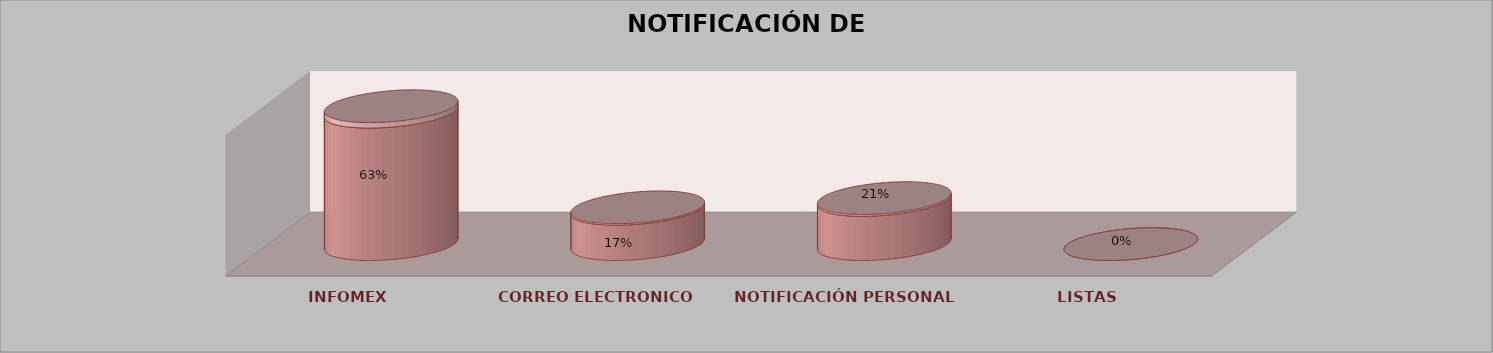
| Category | Series 0 | Series 1 | Series 2 | Series 3 | Series 4 |
|---|---|---|---|---|---|
| INFOMEX |  |  |  | 15 | 0.625 |
| CORREO ELECTRONICO |  |  |  | 4 | 0.167 |
| NOTIFICACIÓN PERSONAL |  |  |  | 5 | 0.208 |
| LISTAS |  |  |  | 0 | 0 |